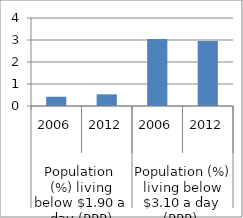
| Category | Series 0 |
|---|---|
| 0 | 0.42 |
| 1 | 0.53 |
| 2 | 3.04 |
| 3 | 2.96 |